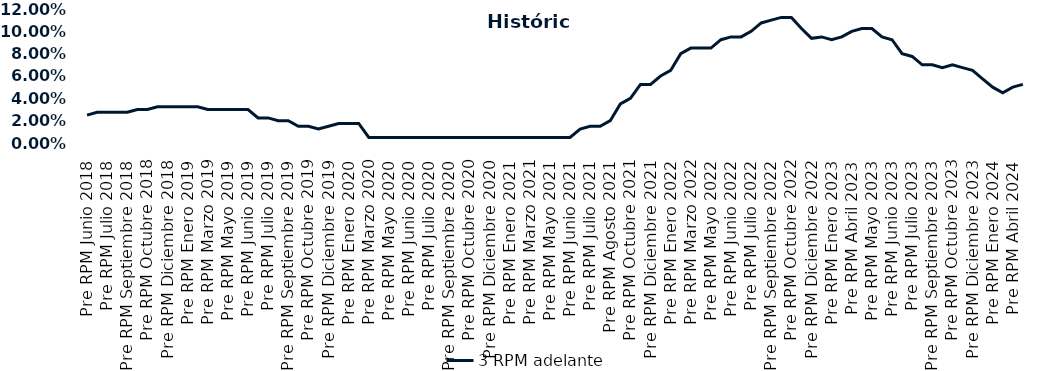
| Category | 3 RPM adelante |
|---|---|
| Pre RPM Junio 2018 | 0.025 |
| Post RPM Junio 2018 | 0.028 |
| Pre RPM Julio 2018 | 0.028 |
| Post RPM Julio 2018 | 0.028 |
| Pre RPM Septiembre 2018 | 0.028 |
| Post RPM Septiembre 2018 | 0.03 |
| Pre RPM Octubre 2018 | 0.03 |
| Post RPM Octubre 2018 | 0.032 |
| Pre RPM Diciembre 2018 | 0.032 |
| Post RPM Diciembre 2018 | 0.032 |
| Pre RPM Enero 2019 | 0.032 |
| Post RPM Enero 2019 | 0.032 |
| Pre RPM Marzo 2019 | 0.03 |
| Post RPM Marzo 2019 | 0.03 |
| Pre RPM Mayo 2019 | 0.03 |
| Post RPM Mayo 2019 | 0.03 |
| Pre RPM Junio 2019 | 0.03 |
| Post RPM Junio 2019 | 0.022 |
| Pre RPM Julio 2019 | 0.022 |
| Post RPM Julio 2019 | 0.02 |
| Pre RPM Septiembre 2019 | 0.02 |
| Post RPM Septiembre 2019 | 0.015 |
| Pre RPM Octubre 2019 | 0.015 |
| Post RPM Octubre 2019 | 0.012 |
| Pre RPM Diciembre 2019 | 0.015 |
| Post RPM Diciembre 2019 | 0.018 |
| Pre RPM Enero 2020 | 0.018 |
| Post RPM Enero 2020 | 0.018 |
| Pre RPM Marzo 2020 | 0.005 |
| Post RPM Marzo 2020 | 0.005 |
| Pre RPM Mayo 2020 | 0.005 |
| Post RPM Mayo 2020 | 0.005 |
| Pre RPM Junio 2020 | 0.005 |
| Post RPM Junio 2020 | 0.005 |
| Pre RPM Julio 2020 | 0.005 |
| Post RPM Julio 2020 | 0.005 |
| Pre RPM Septiembre 2020 | 0.005 |
| Post RPM Septiembre 2020 | 0.005 |
| Pre RPM Octubre 2020 | 0.005 |
| Post RPM Octubre 2020 | 0.005 |
| Pre RPM Diciembre 2020 | 0.005 |
| Post RPM Diciembre 2020 | 0.005 |
| Pre RPM Enero 2021 | 0.005 |
| Post RPM Enero 2021 | 0.005 |
| Pre RPM Marzo 2021 | 0.005 |
| Post RPM Marzo 2021 | 0.005 |
| Pre RPM Mayo 2021 | 0.005 |
| Post RPM Mayo 2021 | 0.005 |
| Pre RPM Junio 2021 | 0.005 |
| Post RPM Junio 2021 | 0.012 |
| Pre RPM Julio 2021 | 0.015 |
| Post RPM Julio 2021 | 0.015 |
| Pre RPM Agosto 2021 | 0.02 |
| Post RPM Agosto 2021 | 0.035 |
| Pre RPM Octubre 2021 | 0.04 |
| Post RPM Octubre 2021 | 0.052 |
| Pre RPM Diciembre 2021 | 0.052 |
| Post RPM Diciembre 2021 | 0.06 |
| Pre RPM Enero 2022 | 0.065 |
| Post RPM Enero 2022 | 0.08 |
| Pre RPM Marzo 2022 | 0.085 |
| Post RPM Marzo 2022 | 0.085 |
| Pre RPM Mayo 2022 | 0.085 |
| Post RPM Mayo 2022 | 0.092 |
| Pre RPM Junio 2022 | 0.095 |
| Post RPM Junio 2022 | 0.095 |
| Pre RPM Julio 2022 | 0.1 |
| Post RPM Julio 2022 | 0.108 |
| Pre RPM Septiembre 2022 | 0.11 |
| Post RPM Septiembre 2022 | 0.112 |
| Pre RPM Octubre 2022 | 0.112 |
| Post RPM Octubre 2022 | 0.102 |
| Pre RPM Diciembre 2022 | 0.094 |
| Post RPM Diciembre 2022 | 0.095 |
| Pre RPM Enero 2023 | 0.092 |
| Post RPM Enero 2023 | 0.095 |
| Pre RPM Abril 2023 | 0.1 |
| Post RPM Abril 2023 | 0.102 |
| Pre RPM Mayo 2023 | 0.102 |
| Post RPM Mayo 2023 | 0.095 |
| Pre RPM Junio 2023 | 0.092 |
| Post RPM Junio 2023 | 0.08 |
| Pre RPM Julio 2023 | 0.078 |
| Post RPM Julio 2023 | 0.07 |
| Pre RPM Septiembre 2023 | 0.07 |
| Post RPM Septiembre 2023 | 0.068 |
| Pre RPM Octubre 2023 | 0.07 |
| Post RPM Octubre 2023 | 0.068 |
| Pre RPM Diciembre 2023 | 0.065 |
| Post RPM Diciembre 2023 | 0.058 |
| Pre RPM Enero 2024 | 0.05 |
| Post RPM Enero 2024 | 0.045 |
| Pre RPM Abril 2024 | 0.05 |
| Post RPM Abril 2024 | 0.052 |